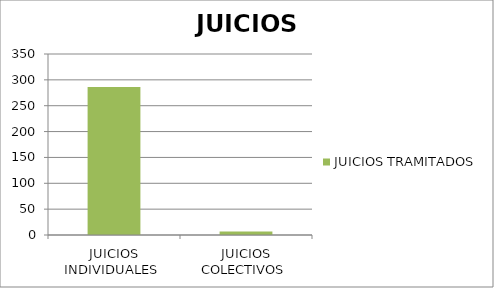
| Category | JUICIOS TRAMITADOS  |
|---|---|
| JUICIOS INDIVIDUALES  | 286 |
| JUICIOS COLECTIVOS  | 7 |